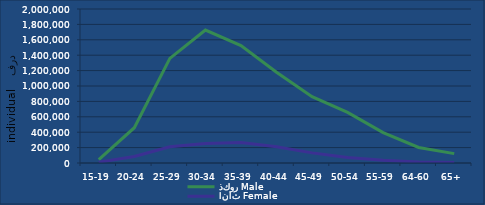
| Category | ذكور | اناث |
|---|---|---|
| 15-19 | 42695 | 11255 |
| 20-24 | 458051 | 84101 |
| 25-29 | 1358719 | 209773 |
| 30-34 | 1726883 | 252720 |
| 35-39 | 1524876 | 264840 |
| 40-44 | 1179165 | 210414 |
| 45-49 | 861159 | 131535 |
| 50-54 | 656653 | 72437 |
| 55-59 | 395374 | 35750 |
| 64-60 | 201669 | 13389 |
| 65+ | 121918 | 5216 |